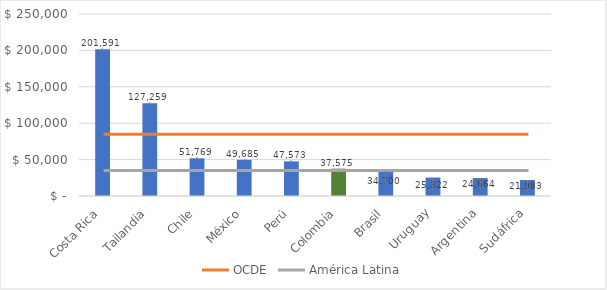
| Category | Series 0 |
|---|---|
| Costa Rica | 201590.568 |
| Tailandia | 127258.886 |
| Chile | 51769.188 |
| México | 49684.667 |
| Perú | 47573.173 |
| Colombia | 37575.204 |
| Brasil | 34699.958 |
| Uruguay | 25322.492 |
| Argentina | 24663.554 |
| Sudáfrica | 21982.938 |